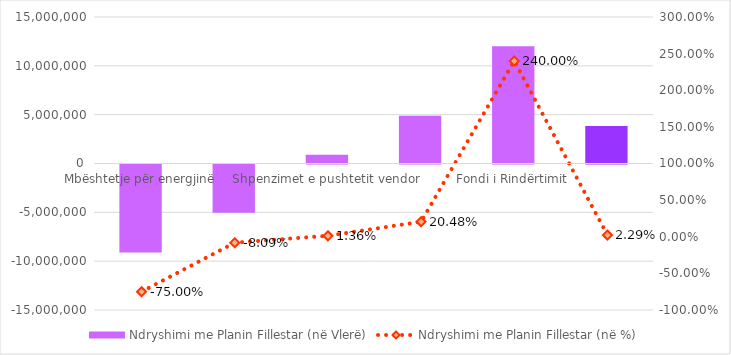
| Category | Ndryshimi me Planin Fillestar (në Vlerë) |
|---|---|
| Mbështetje për energjinë | -9000000 |
| Kosto e borxhit | -4933000 |
| Shpenzimet e pushtetit vendor | 889000 |
| Fondi Rezervë dhe Kontingjencë i Këshillit të Ministrave | 4880000 |
| Fondi i Rindërtimit | 12000000 |
| Total Shpenzime të Tjera të Paklasifikuara | 3836000 |